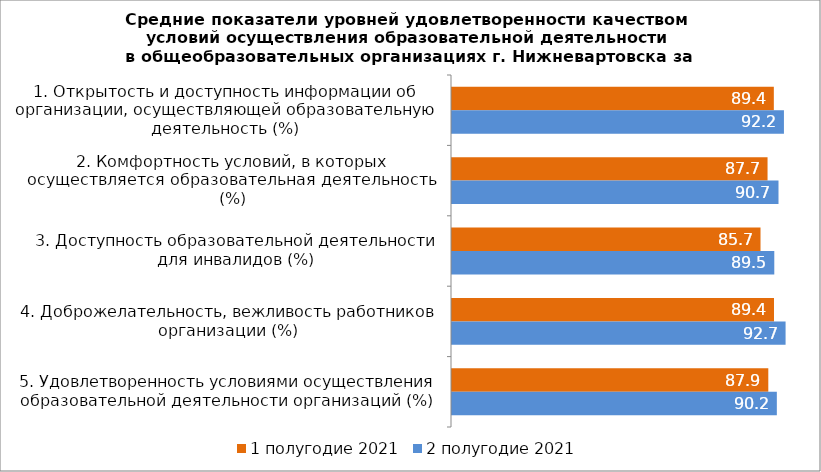
| Category | 1 полугодие 2021 | 2 полугодие 2021 |
|---|---|---|
| 1. Открытость и доступность информации об организации, осуществляющей образовательную деятельность (%) | 89.399 | 92.205 |
| 2. Комфортность условий, в которых осуществляется образовательная деятельность (%) | 87.652 | 90.694 |
| 3. Доступность образовательной деятельности для инвалидов (%) | 85.698 | 89.525 |
| 4. Доброжелательность, вежливость работников организации (%) | 89.443 | 92.661 |
| 5. Удовлетворенность условиями осуществления образовательной деятельности организаций (%) | 87.86 | 90.234 |